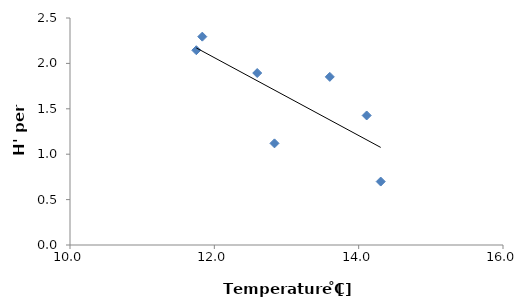
| Category | mean H' |
|---|---|
| 11.833333333 | 2.295 |
| 11.75 | 2.145 |
| 14.111111111 | 1.426 |
| 12.594444444 | 1.894 |
| 14.305555556 | 0.699 |
| 12.833333333 | 1.119 |
| 13.6 | 1.852 |